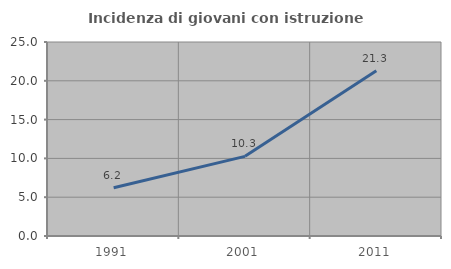
| Category | Incidenza di giovani con istruzione universitaria |
|---|---|
| 1991.0 | 6.213 |
| 2001.0 | 10.263 |
| 2011.0 | 21.296 |